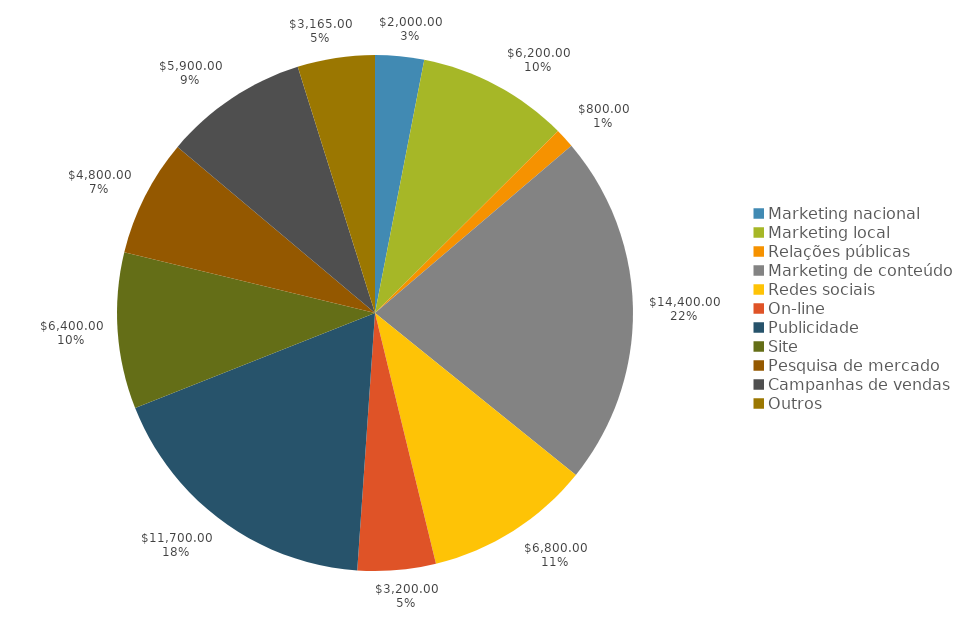
| Category | Series 0 | Series 1 |
|---|---|---|
| Marketing nacional | 2000 | 0.031 |
| Marketing local | 6200 | 0.095 |
| Relações públicas | 800 | 0.012 |
| Marketing de conteúdo | 14400 | 0.22 |
| Redes sociais | 6800 | 0.104 |
| On-line | 3200 | 0.049 |
| Publicidade | 11700 | 0.179 |
| Site | 6400 | 0.098 |
| Pesquisa de mercado | 4800 | 0.073 |
| Campanhas de vendas | 5900 | 0.09 |
| Outros | 3165 | 0.048 |